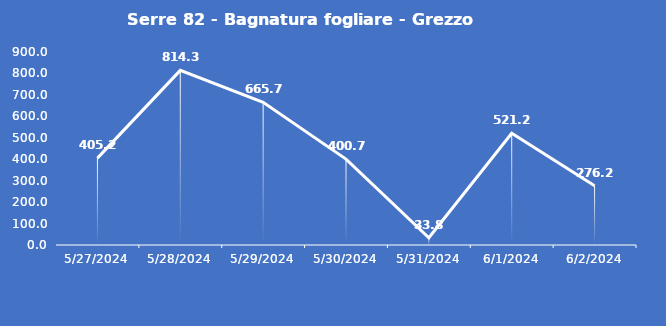
| Category | Serre 82 - Bagnatura fogliare - Grezzo (min) |
|---|---|
| 5/27/24 | 405.2 |
| 5/28/24 | 814.3 |
| 5/29/24 | 665.7 |
| 5/30/24 | 400.7 |
| 5/31/24 | 33.8 |
| 6/1/24 | 521.2 |
| 6/2/24 | 276.2 |